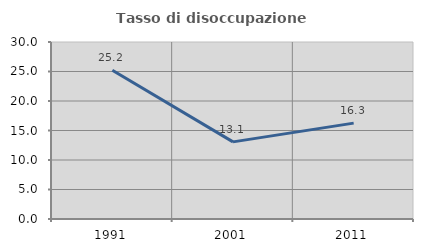
| Category | Tasso di disoccupazione giovanile  |
|---|---|
| 1991.0 | 25.225 |
| 2001.0 | 13.072 |
| 2011.0 | 16.25 |